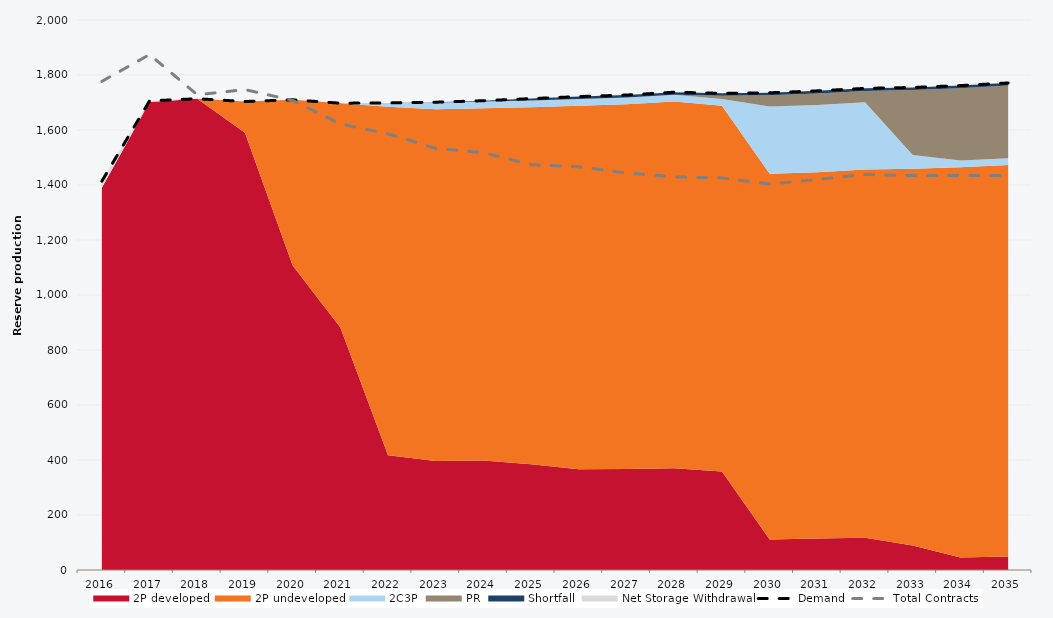
| Category | Demand | Total Contracts |
|---|---|---|
| 0 | 1413.954 | 1776.781 |
| 1 | 1705.825 | 1874.371 |
| 2 | 1713.662 | 1727.997 |
| 3 | 1703.53 | 1746.967 |
| 4 | 1709.841 | 1707.643 |
| 5 | 1697.452 | 1621.977 |
| 6 | 1698.504 | 1586.126 |
| 7 | 1701.028 | 1533.126 |
| 8 | 1706.532 | 1517.777 |
| 9 | 1714.203 | 1474.136 |
| 10 | 1721.486 | 1466.013 |
| 11 | 1727.209 | 1443.817 |
| 12 | 1737.453 | 1429.645 |
| 13 | 1733.34 | 1425.788 |
| 14 | 1735.334 | 1403.548 |
| 15 | 1742.343 | 1420.349 |
| 16 | 1751.406 | 1438.314 |
| 17 | 1754.758 | 1434.467 |
| 18 | 1761.488 | 1434.453 |
| 19 | 1771.14 | 1434.032 |